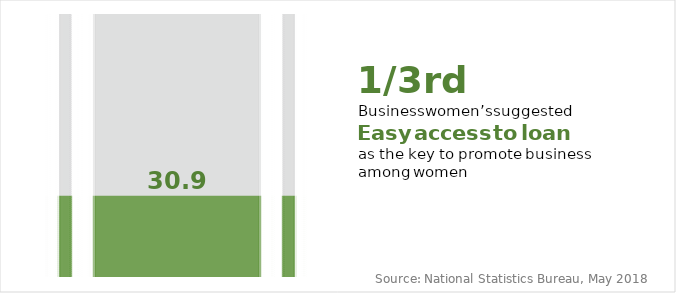
| Category | Series 1 |
|---|---|
| Easy access to loan | 100 |